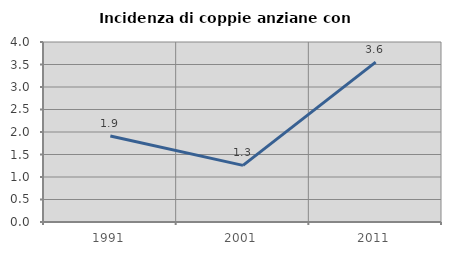
| Category | Incidenza di coppie anziane con figli |
|---|---|
| 1991.0 | 1.911 |
| 2001.0 | 1.259 |
| 2011.0 | 3.554 |